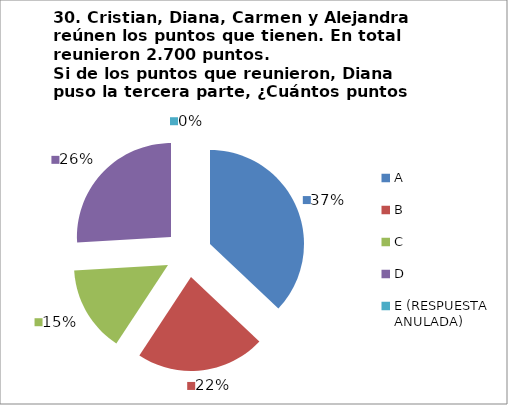
| Category | CANTIDAD DE RESPUESTAS PREGUNTA (30) | PORCENTAJE |
|---|---|---|
| A | 10 | 0.37 |
| B | 6 | 0.222 |
| C | 4 | 0.148 |
| D | 7 | 0.259 |
| E (RESPUESTA ANULADA) | 0 | 0 |